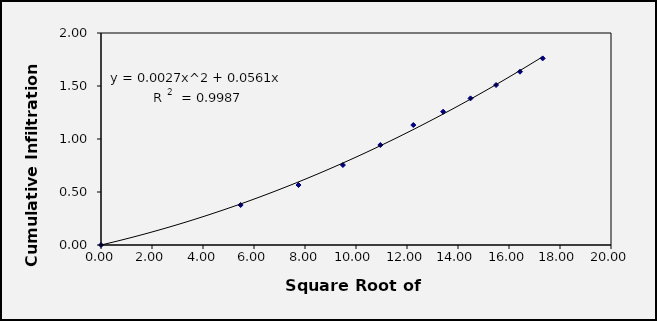
| Category | Series 0 |
|---|---|
| 0.0 | 0 |
| 5.477225575051661 | 0.377 |
| 7.745966692414834 | 0.566 |
| 9.486832980505138 | 0.755 |
| 10.954451150103322 | 0.943 |
| 12.24744871391589 | 1.132 |
| 13.416407864998739 | 1.258 |
| 14.491376746189438 | 1.383 |
| 15.491933384829668 | 1.509 |
| 16.431676725154983 | 1.635 |
| 17.320508075688775 | 1.761 |